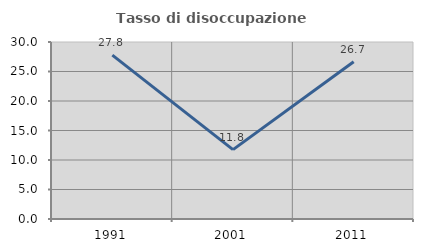
| Category | Tasso di disoccupazione giovanile  |
|---|---|
| 1991.0 | 27.778 |
| 2001.0 | 11.765 |
| 2011.0 | 26.667 |